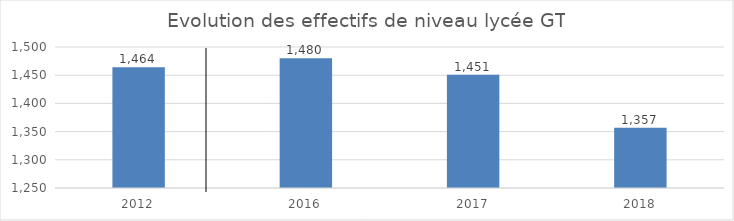
| Category | Series 0 |
|---|---|
| 2012.0 | 1464 |
| 2016.0 | 1480 |
| 2017.0 | 1451 |
| 2018.0 | 1357 |